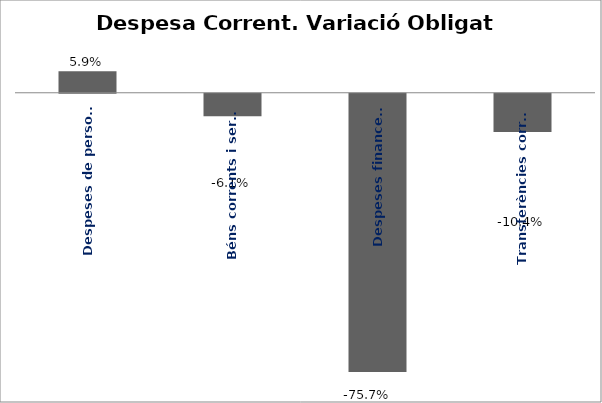
| Category | Series 0 |
|---|---|
| Despeses de personal | 0.059 |
| Béns corrents i serveis | -0.061 |
| Despeses financeres | -0.757 |
| Transferències corrents | -0.104 |